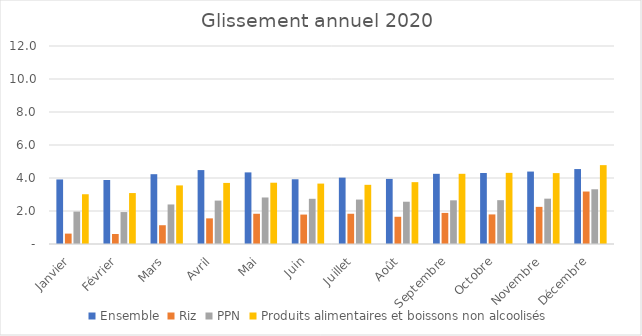
| Category | Ensemble | Riz | PPN | Produits alimentaires et boissons non alcoolisés |
|---|---|---|---|---|
| Janvier | 3.912 | 0.63 | 1.964 | 3.016 |
| Février | 3.88 | 0.606 | 1.936 | 3.088 |
| Mars | 4.231 | 1.138 | 2.397 | 3.551 |
| Avril | 4.48 | 1.553 | 2.631 | 3.702 |
| Mai | 4.34 | 1.833 | 2.819 | 3.714 |
| Juin | 3.924 | 1.783 | 2.74 | 3.661 |
| Juillet | 4.022 | 1.833 | 2.693 | 3.587 |
| Août | 3.945 | 1.65 | 2.562 | 3.748 |
| Septembre | 4.254 | 1.884 | 2.647 | 4.254 |
| Octobre | 4.302 | 1.792 | 2.657 | 4.312 |
| Novembre | 4.39 | 2.251 | 2.748 | 4.296 |
| Décembre | 4.542 | 3.18 | 3.317 | 4.779 |